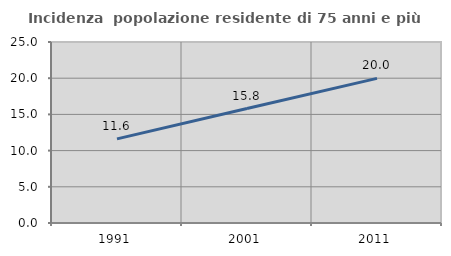
| Category | Incidenza  popolazione residente di 75 anni e più |
|---|---|
| 1991.0 | 11.616 |
| 2001.0 | 15.815 |
| 2011.0 | 19.972 |